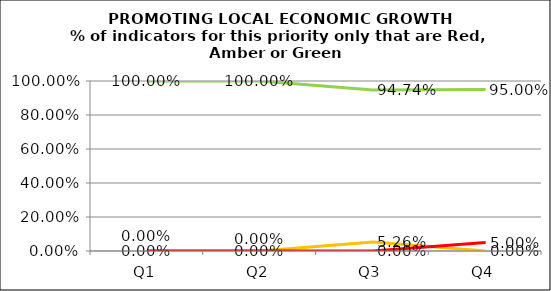
| Category | Green | Amber | Red |
|---|---|---|---|
| Q1 | 1 | 0 | 0 |
| Q2 | 1 | 0 | 0 |
| Q3 | 0.947 | 0.053 | 0 |
| Q4 | 0.95 | 0 | 0.05 |